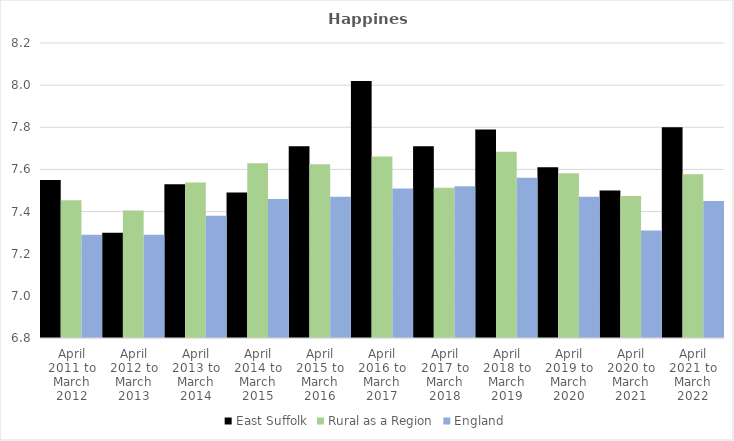
| Category | East Suffolk | Rural as a Region | England |
|---|---|---|---|
| April 2011 to March 2012 | 7.55 | 7.454 | 7.29 |
| April 2012 to March 2013 | 7.3 | 7.406 | 7.29 |
| April 2013 to March 2014 | 7.53 | 7.539 | 7.38 |
| April 2014 to March 2015 | 7.49 | 7.63 | 7.46 |
| April 2015 to March 2016 | 7.71 | 7.625 | 7.47 |
| April 2016 to March 2017 | 8.02 | 7.661 | 7.51 |
| April 2017 to March 2018 | 7.71 | 7.513 | 7.52 |
| April 2018 to March 2019 | 7.79 | 7.684 | 7.56 |
| April 2019 to March 2020 | 7.61 | 7.582 | 7.47 |
| April 2020 to March 2021 | 7.5 | 7.474 | 7.31 |
| April 2021 to March 2022 | 7.8 | 7.577 | 7.45 |